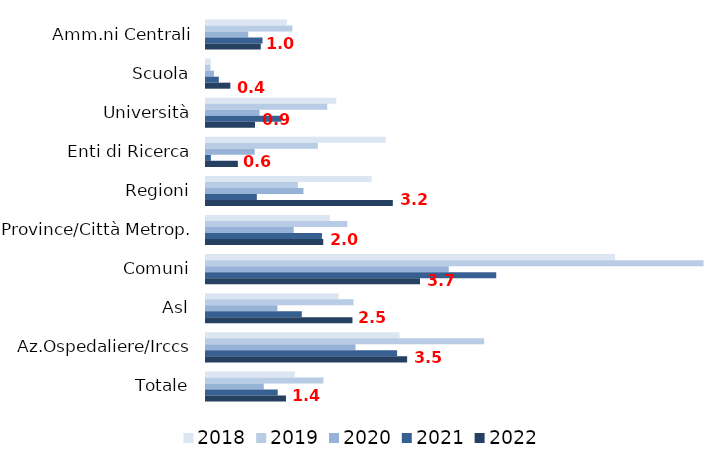
| Category | 2018 | 2019 | 2020 | 2021 | 2022 |
|---|---|---|---|---|---|
| Amm.ni Centrali | 1.406 | 1.501 | 0.735 | 0.982 | 0.951 |
| Scuola | 0.082 | 0.079 | 0.139 | 0.223 | 0.423 |
| Università | 2.263 | 2.106 | 0.931 | 1.311 | 0.851 |
| Enti di Ricerca | 3.123 | 1.943 | 0.847 | 0.085 | 0.554 |
| Regioni | 2.876 | 1.595 | 1.693 | 0.883 | 3.246 |
| Province/Città Metrop. | 2.152 | 2.457 | 1.524 | 2.014 | 2.038 |
| Comuni | 7.108 | 8.645 | 4.218 | 5.043 | 3.718 |
| Asl | 2.306 | 2.563 | 1.241 | 1.665 | 2.545 |
| Az.Ospedaliere/Irccs | 3.362 | 4.833 | 2.598 | 3.32 | 3.495 |
| Totale | 1.543 | 2.039 | 1.004 | 1.246 | 1.389 |